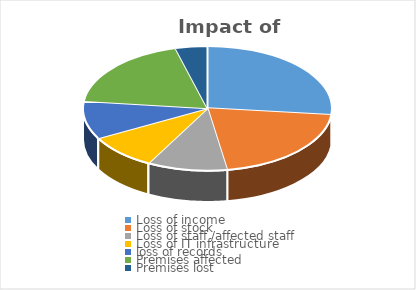
| Category | Series 0 |
|---|---|
| Loss of income | 90 |
| Loss of stock  | 70 |
| Loss of staff /affected staff | 35 |
| Loss of IT infrastructure | 31 |
| loss of records  | 33 |
| Premises affected | 64 |
| Premises lost | 14 |